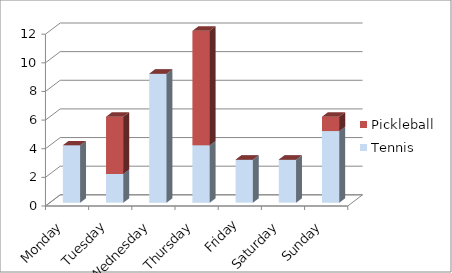
| Category | Tennis | Pickleball |
|---|---|---|
| Monday | 4 | 0 |
| Tuesday | 2 | 4 |
| Wednesday | 9 | 0 |
| Thursday | 4 | 8 |
| Friday | 3 | 0 |
| Saturday | 3 | 0 |
| Sunday | 5 | 1 |